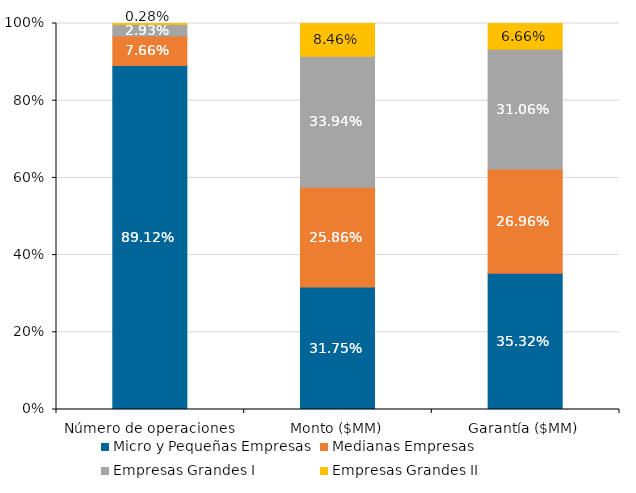
| Category | Micro y Pequeñas Empresas | Medianas Empresas | Empresas Grandes I | Empresas Grandes II |
|---|---|---|---|---|
| Número de operaciones | 0.891 | 0.077 | 0.029 | 0.003 |
| Monto ($MM) | 0.317 | 0.259 | 0.339 | 0.085 |
| Garantía ($MM) | 0.353 | 0.27 | 0.311 | 0.067 |